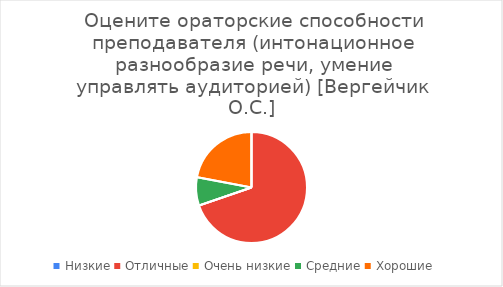
| Category | Series 0 |
|---|---|
| Низкие | 0 |
| Отличные | 76 |
| Очень низкие | 0 |
| Средние | 9 |
| Хорошие | 24 |